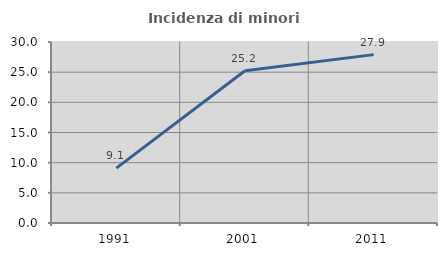
| Category | Incidenza di minori stranieri |
|---|---|
| 1991.0 | 9.091 |
| 2001.0 | 25.234 |
| 2011.0 | 27.907 |